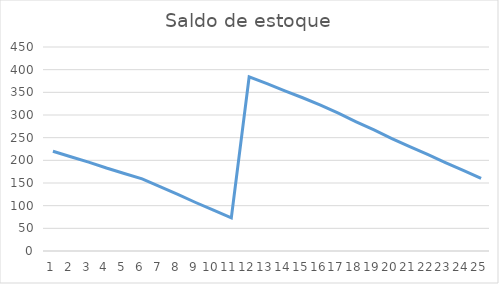
| Category | Saldo inicial |
|---|---|
| 0 | 220 |
| 1 | 208 |
| 2 | 196 |
| 3 | 183 |
| 4 | 171 |
| 5 | 159 |
| 6 | 142 |
| 7 | 125 |
| 8 | 107 |
| 9 | 90 |
| 10 | 73 |
| 11 | 384 |
| 12 | 369 |
| 13 | 353 |
| 14 | 338 |
| 15 | 322 |
| 16 | 304 |
| 17 | 285 |
| 18 | 267 |
| 19 | 248 |
| 20 | 230 |
| 21 | 213 |
| 22 | 195 |
| 23 | 178 |
| 24 | 160 |